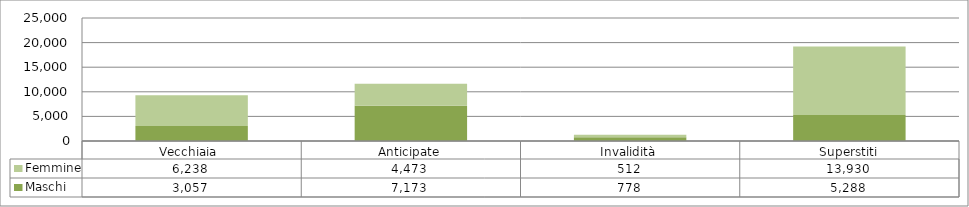
| Category | Maschi | Femmine |
|---|---|---|
| Vecchiaia  | 3057 | 6238 |
| Anticipate | 7173 | 4473 |
| Invalidità | 778 | 512 |
| Superstiti | 5288 | 13930 |